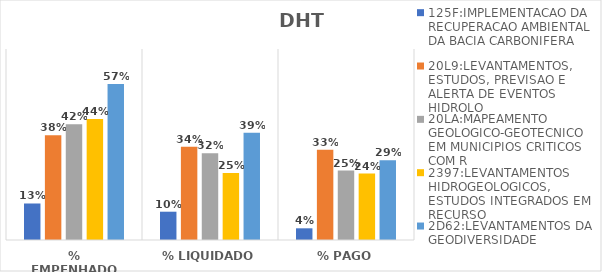
| Category | 125F:IMPLEMENTACAO DA RECUPERACAO AMBIENTAL DA BACIA CARBONIFERA | 20L9:LEVANTAMENTOS, ESTUDOS, PREVISAO E ALERTA DE EVENTOS HIDROLO | 20LA:MAPEAMENTO GEOLOGICO-GEOTECNICO EM MUNICIPIOS CRITICOS COM R | 2397:LEVANTAMENTOS HIDROGEOLOGICOS, ESTUDOS INTEGRADOS EM RECURSO | 2D62:LEVANTAMENTOS DA GEODIVERSIDADE |
|---|---|---|---|---|---|
| % EMPENHADO | 0.134 | 0.384 | 0.424 | 0.444 | 0.572 |
| % LIQUIDADO | 0.104 | 0.342 | 0.318 | 0.246 | 0.393 |
| % PAGO | 0.043 | 0.331 | 0.255 | 0.243 | 0.293 |